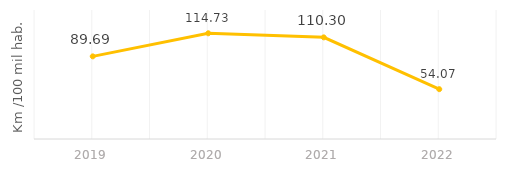
| Category | Tasa de kilómetros de rutas de transporte público por cada 100mil habitantes: |
|---|---|
| 2019.0 | 89.69 |
| 2020.0 | 114.729 |
| 2021.0 | 110.303 |
| 2022.0 | 54.069 |